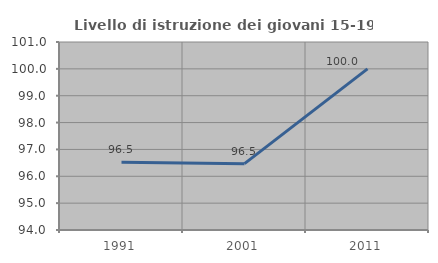
| Category | Livello di istruzione dei giovani 15-19 anni |
|---|---|
| 1991.0 | 96.522 |
| 2001.0 | 96.471 |
| 2011.0 | 100 |